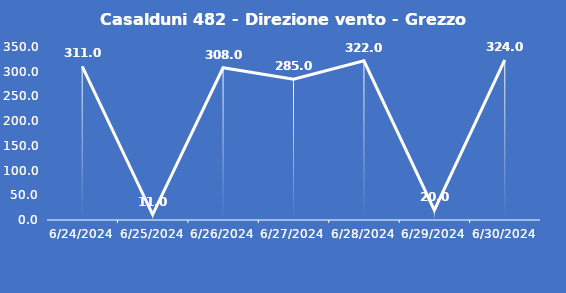
| Category | Casalduni 482 - Direzione vento - Grezzo (°N) |
|---|---|
| 6/24/24 | 311 |
| 6/25/24 | 11 |
| 6/26/24 | 308 |
| 6/27/24 | 285 |
| 6/28/24 | 322 |
| 6/29/24 | 20 |
| 6/30/24 | 324 |